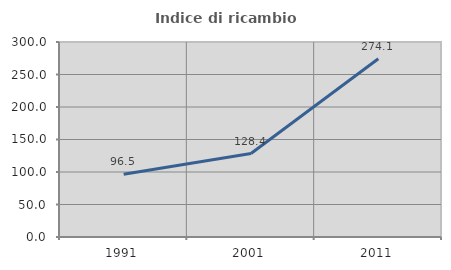
| Category | Indice di ricambio occupazionale  |
|---|---|
| 1991.0 | 96.502 |
| 2001.0 | 128.448 |
| 2011.0 | 274.125 |